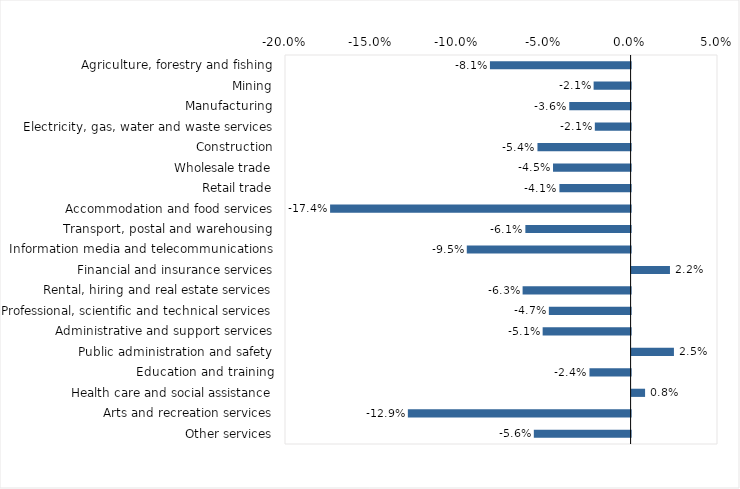
| Category | This week |
|---|---|
| Agriculture, forestry and fishing | -0.081 |
| Mining | -0.021 |
| Manufacturing | -0.036 |
| Electricity, gas, water and waste services | -0.021 |
| Construction | -0.054 |
| Wholesale trade | -0.045 |
| Retail trade | -0.041 |
| Accommodation and food services | -0.174 |
| Transport, postal and warehousing | -0.061 |
| Information media and telecommunications | -0.095 |
| Financial and insurance services | 0.022 |
| Rental, hiring and real estate services | -0.062 |
| Professional, scientific and technical services | -0.047 |
| Administrative and support services | -0.051 |
| Public administration and safety | 0.024 |
| Education and training | -0.024 |
| Health care and social assistance | 0.008 |
| Arts and recreation services | -0.129 |
| Other services | -0.056 |